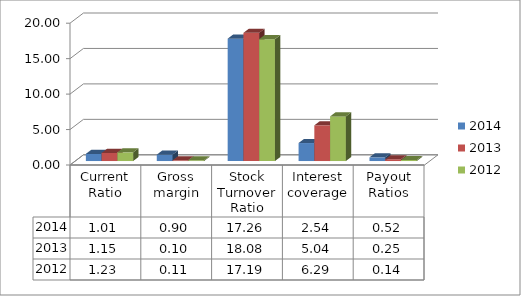
| Category | 2014 | 2013 | 2012 |
|---|---|---|---|
| Current Ratio | 1.008 | 1.147 | 1.226 |
| Gross margin | 0.9 | 0.1 | 0.11 |
| Stock Turnover Ratio | 17.262 | 18.081 | 17.192 |
| Interest coverage | 2.538 | 5.039 | 6.293 |
| Payout Ratios | 0.521 | 0.25 | 0.143 |